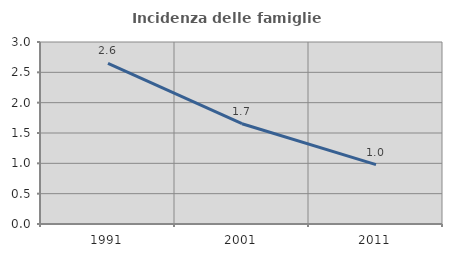
| Category | Incidenza delle famiglie numerose |
|---|---|
| 1991.0 | 2.647 |
| 2001.0 | 1.653 |
| 2011.0 | 0.978 |